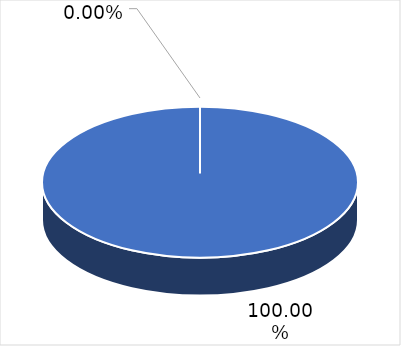
| Category | Series 0 | Series 1 |
|---|---|---|
| Física | 0 | 0 |
| Electrónica | 1 | 1 |